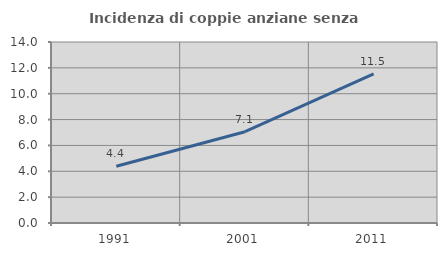
| Category | Incidenza di coppie anziane senza figli  |
|---|---|
| 1991.0 | 4.387 |
| 2001.0 | 7.062 |
| 2011.0 | 11.528 |